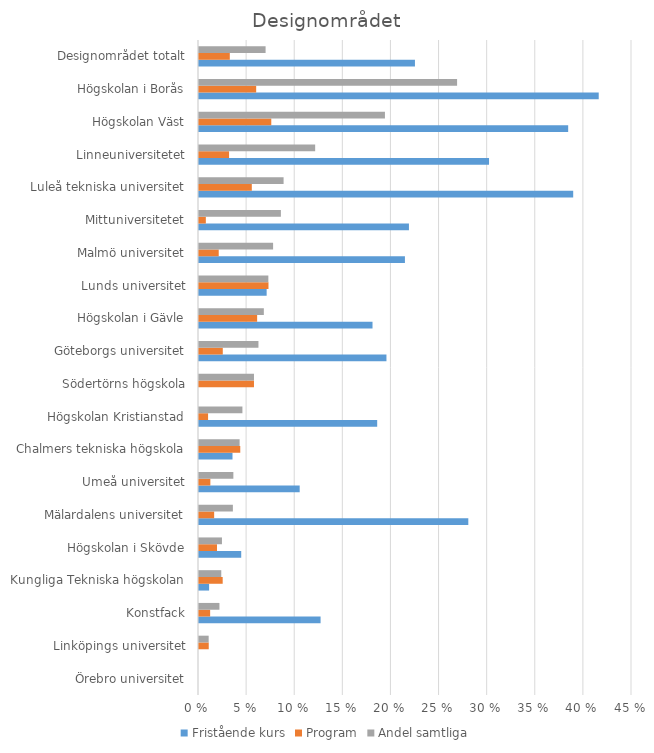
| Category | Fristående kurs | Program | Andel samtliga |
|---|---|---|---|
| Örebro universitet | 0 | 0 | 0 |
| Linköpings universitet | 0 | 0.01 | 0.01 |
| Konstfack | 0.126 | 0.012 | 0.021 |
| Kungliga Tekniska högskolan | 0.01 | 0.025 | 0.023 |
| Högskolan i Skövde | 0.044 | 0.019 | 0.024 |
| Mälardalens universitet | 0.28 | 0.016 | 0.035 |
| Umeå universitet | 0.105 | 0.012 | 0.036 |
| Chalmers tekniska högskola | 0.035 | 0.043 | 0.042 |
| Högskolan Kristianstad | 0.185 | 0.009 | 0.045 |
| Södertörns högskola | 0 | 0.057 | 0.057 |
| Göteborgs universitet | 0.195 | 0.025 | 0.062 |
| Högskolan i Gävle | 0.18 | 0.06 | 0.067 |
| Lunds universitet | 0.07 | 0.072 | 0.072 |
| Malmö universitet | 0.214 | 0.021 | 0.077 |
| Mittuniversitetet | 0.218 | 0.007 | 0.085 |
| Luleå tekniska universitet | 0.389 | 0.055 | 0.088 |
| Linneuniversitetet | 0.301 | 0.031 | 0.121 |
| Högskolan Väst | 0.384 | 0.075 | 0.193 |
| Högskolan i Borås | 0.415 | 0.059 | 0.268 |
| Designområdet totalt | 0.224 | 0.032 | 0.069 |